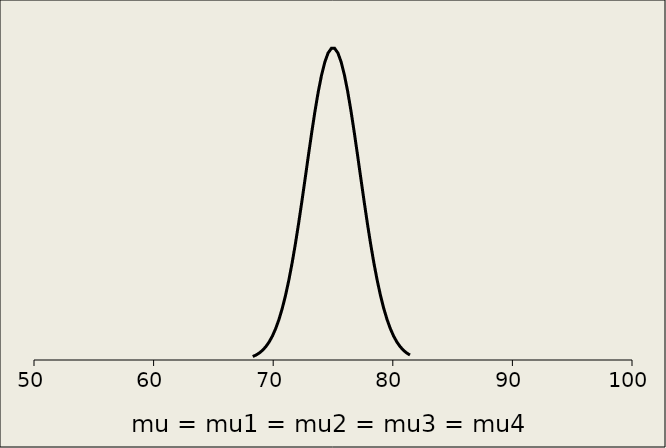
| Category | All conditions |
|---|---|
| 68.29179606750063 | 0.002 |
| 68.56560030964344 | 0.003 |
| 68.83940455178629 | 0.004 |
| 69.11320879392912 | 0.006 |
| 69.38701303607195 | 0.008 |
| 69.66081727821478 | 0.01 |
| 69.9346215203576 | 0.014 |
| 70.20842576250044 | 0.018 |
| 70.48223000464327 | 0.023 |
| 70.7560342467861 | 0.029 |
| 71.02983848892893 | 0.037 |
| 71.30364273107176 | 0.046 |
| 71.57744697321459 | 0.055 |
| 71.85125121535742 | 0.066 |
| 72.12505545750025 | 0.078 |
| 72.39885969964308 | 0.091 |
| 72.67266394178591 | 0.104 |
| 72.94646818392874 | 0.117 |
| 73.22027242607157 | 0.13 |
| 73.4940766682144 | 0.142 |
| 73.76788091035723 | 0.153 |
| 74.04168515250007 | 0.163 |
| 74.3154893946429 | 0.17 |
| 74.58929363678573 | 0.175 |
| 74.86309787892856 | 0.178 |
| 75.13690212107139 | 0.178 |
| 75.4107063632142 | 0.175 |
| 75.68451060535703 | 0.17 |
| 75.95831484749988 | 0.163 |
| 76.2321190896427 | 0.153 |
| 76.50592333178554 | 0.142 |
| 76.77972757392837 | 0.13 |
| 77.0535318160712 | 0.117 |
| 77.32733605821403 | 0.104 |
| 77.60114030035686 | 0.091 |
| 77.87494454249969 | 0.078 |
| 78.14874878464252 | 0.066 |
| 78.42255302678535 | 0.055 |
| 78.69635726892818 | 0.046 |
| 78.97016151107101 | 0.037 |
| 79.24396575321384 | 0.029 |
| 79.51776999535667 | 0.023 |
| 79.7915742374995 | 0.018 |
| 80.06537847964233 | 0.014 |
| 80.33918272178516 | 0.01 |
| 80.612986963928 | 0.008 |
| 80.88679120607082 | 0.006 |
| 81.16059544821366 | 0.004 |
| 81.43439969035649 | 0.003 |